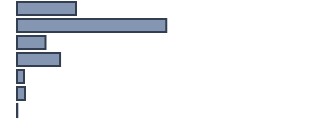
| Category | Series 0 |
|---|---|
| 0 | 20 |
| 1 | 50.6 |
| 2 | 9.7 |
| 3 | 14.6 |
| 4 | 2.4 |
| 5 | 2.7 |
| 6 | 0.1 |